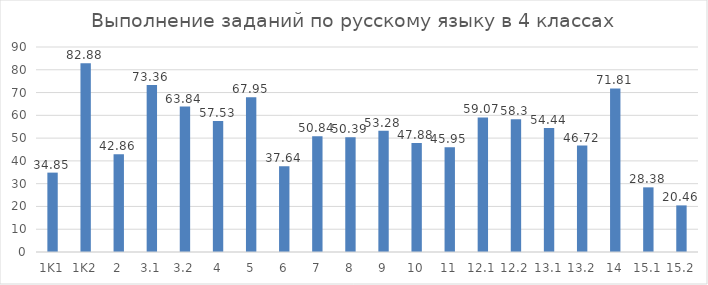
| Category | Series 0 |
|---|---|
| 1K1 | 34.85 |
| 1K2 | 82.88 |
| 2 | 42.86 |
| 3,1 | 73.36 |
| 3,2 | 63.84 |
| 4 | 57.53 |
| 5 | 67.95 |
| 6 | 37.64 |
| 7 | 50.84 |
| 8 | 50.39 |
| 9 | 53.28 |
| 10 | 47.88 |
| 11 | 45.95 |
| 12,1 | 59.07 |
| 12,2 | 58.3 |
| 13,1 | 54.44 |
| 13,2 | 46.72 |
| 14 | 71.81 |
| 15,1 | 28.38 |
| 15,2 | 20.46 |